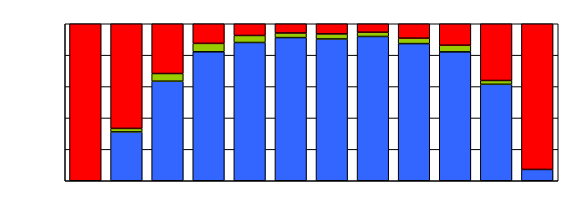
| Category | Series 0 | Series 1 | Series 2 |
|---|---|---|---|
| 0 | 0 | 0 | 134 |
| 1 | 14 | 1 | 30 |
| 2 | 26 | 2 | 13 |
| 3 | 46 | 3 | 7 |
| 4 | 59 | 3 | 5 |
| 5 | 62 | 2 | 4 |
| 6 | 56 | 2 | 4 |
| 7 | 68 | 2 | 4 |
| 8 | 76 | 3 | 8 |
| 9 | 78 | 4 | 13 |
| 10 | 51 | 2 | 30 |
| 11 | 17 | 0 | 219 |